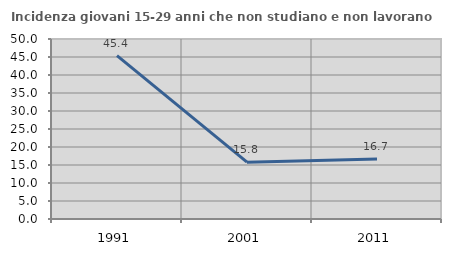
| Category | Incidenza giovani 15-29 anni che non studiano e non lavorano  |
|---|---|
| 1991.0 | 45.388 |
| 2001.0 | 15.789 |
| 2011.0 | 16.667 |